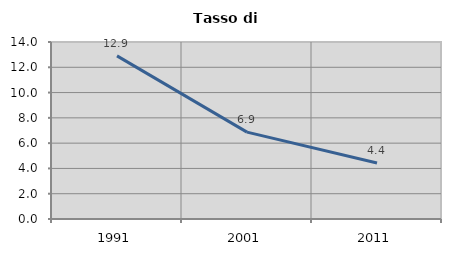
| Category | Tasso di disoccupazione   |
|---|---|
| 1991.0 | 12.903 |
| 2001.0 | 6.87 |
| 2011.0 | 4.425 |